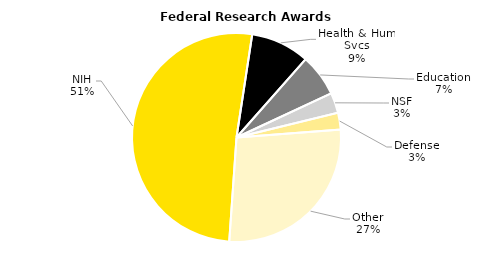
| Category | Series 0 |
|---|---|
| NIH | 187.937 |
| Health & Hum Svcs | 33.361 |
| Education | 23.946 |
| NSF | 11.441 |
| Defense | 9.58 |
| Other | 100.074 |